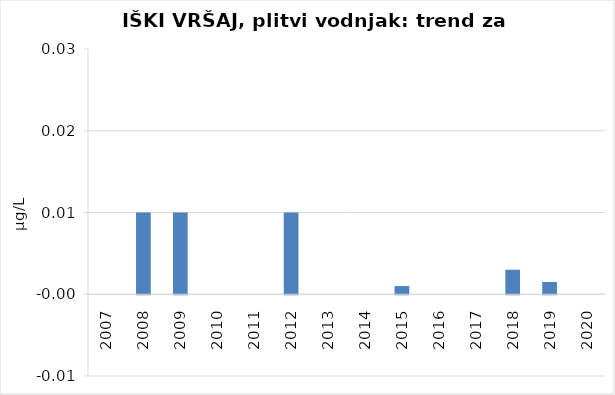
| Category | Vsota |
|---|---|
| 2007 | 0 |
| 2008 | 0.01 |
| 2009 | 0.01 |
| 2010 | 0 |
| 2011 | 0 |
| 2012 | 0.01 |
| 2013 | 0 |
| 2014 | 0 |
| 2015 | 0.001 |
| 2016 | 0 |
| 2017 | 0 |
| 2018 | 0.003 |
| 2019 | 0.002 |
| 2020 | 0 |